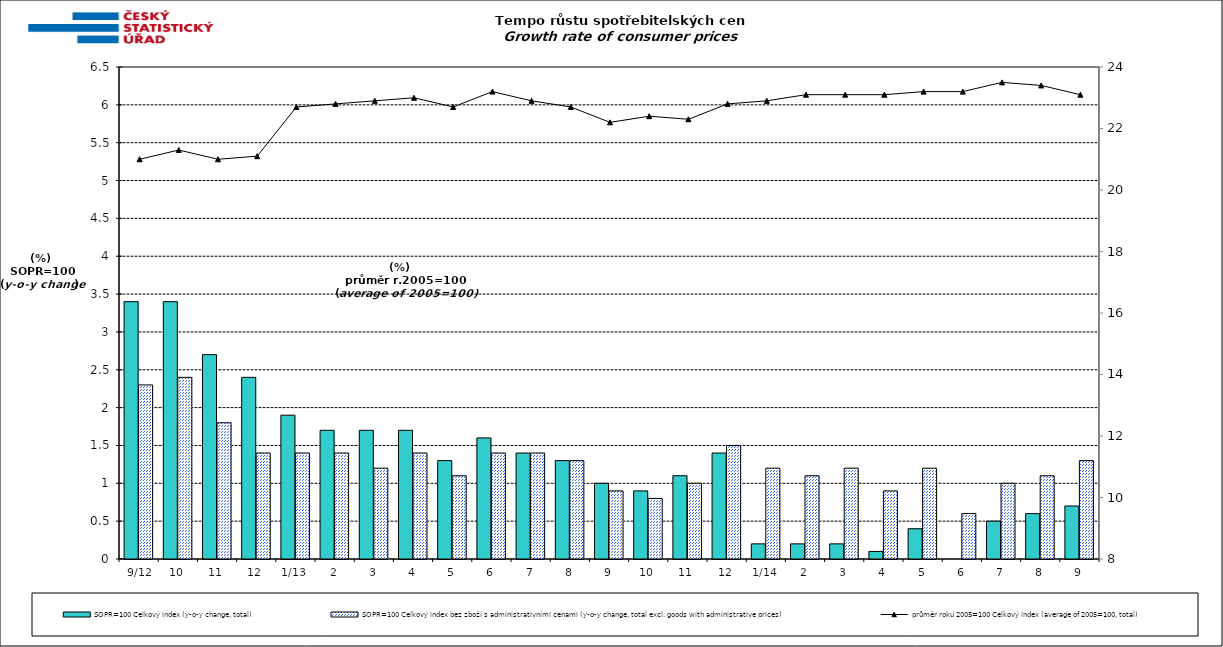
| Category | SOPR=100 Celkový index (y-o-y change, total) | SOPR=100 Celkový index bez zboží s administrativními cenami (y-o-y change, total excl. goods with administrative prices)  |
|---|---|---|
|  9/12 | 3.4 | 2.3 |
| 10 | 3.4 | 2.4 |
| 11 | 2.7 | 1.8 |
| 12 | 2.4 | 1.4 |
| 1/13 | 1.9 | 1.4 |
| 2 | 1.7 | 1.4 |
| 3 | 1.7 | 1.2 |
| 4 | 1.7 | 1.4 |
| 5 | 1.3 | 1.1 |
| 6 | 1.6 | 1.4 |
| 7 | 1.4 | 1.4 |
| 8 | 1.3 | 1.3 |
| 9 | 1 | 0.9 |
| 10 | 0.9 | 0.8 |
| 11 | 1.1 | 1 |
| 12 | 1.4 | 1.5 |
| 1/14 | 0.2 | 1.2 |
| 2 | 0.2 | 1.1 |
| 3 | 0.2 | 1.2 |
| 4 | 0.1 | 0.9 |
| 5 | 0.4 | 1.2 |
| 6 | 0 | 0.6 |
| 7 | 0.5 | 1 |
| 8 | 0.6 | 1.1 |
| 9 | 0.7 | 1.3 |